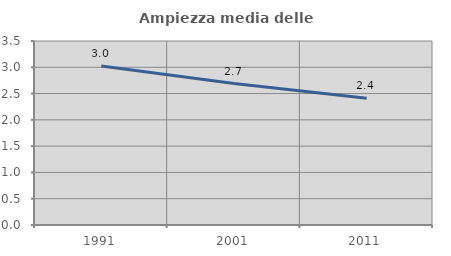
| Category | Ampiezza media delle famiglie |
|---|---|
| 1991.0 | 3.025 |
| 2001.0 | 2.69 |
| 2011.0 | 2.412 |